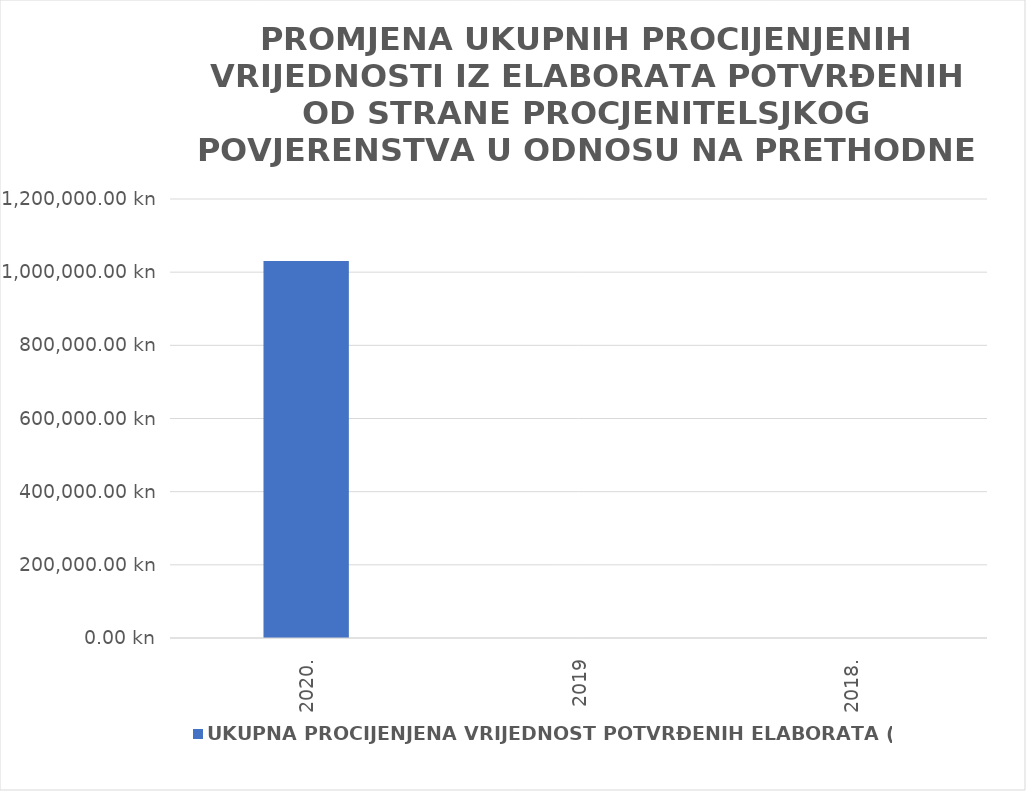
| Category | UKUPNA PROCIJENJENA VRIJEDNOST POTVRĐENIH ELABORATA (u kn) |
|---|---|
| 2020. | 1030800 |
| 2019 | 0 |
| 2018. | 0 |